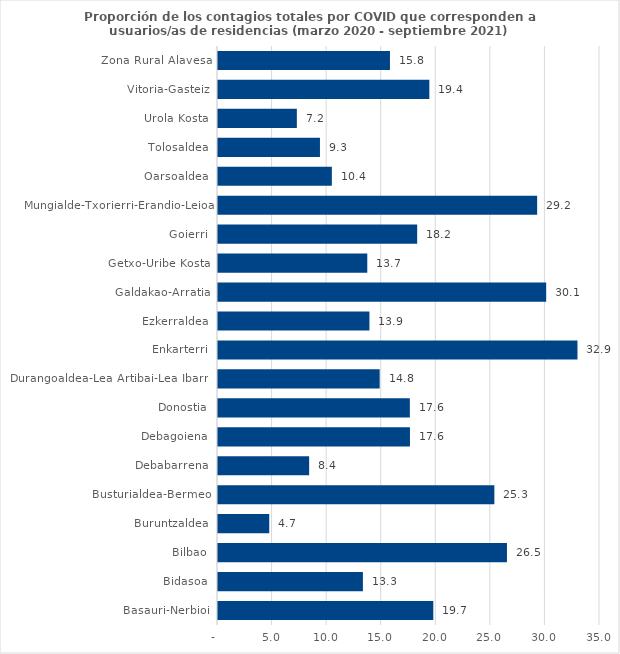
| Category | Series 0 |
|---|---|
| Basauri-Nerbioi | 19.726 |
| Bidasoa | 13.276 |
| Bilbao | 26.475 |
| Buruntzaldea | 4.695 |
| Busturialdea-Bermeo | 25.321 |
| Debabarrena | 8.352 |
| Debagoiena | 17.588 |
| Donostia | 17.578 |
| Durangoaldea-Lea Artibai-Lea Ibarra | 14.813 |
| Enkarterri | 32.935 |
| Ezkerraldea | 13.875 |
| Galdakao-Arratia | 30.07 |
| Getxo-Uribe Kosta | 13.677 |
| Goierri | 18.249 |
| Mungialde-Txorierri-Erandio-Leioa | 29.241 |
| Oarsoaldea | 10.432 |
| Tolosaldea | 9.342 |
| Urola Kosta | 7.225 |
| Vitoria-Gasteiz | 19.364 |
| Zona Rural Alavesa | 15.755 |